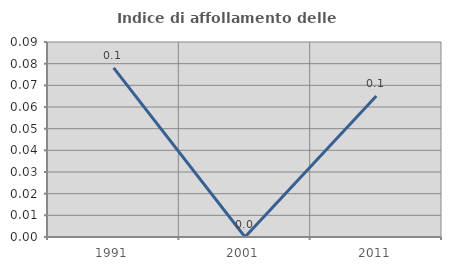
| Category | Indice di affollamento delle abitazioni  |
|---|---|
| 1991.0 | 0.078 |
| 2001.0 | 0 |
| 2011.0 | 0.065 |